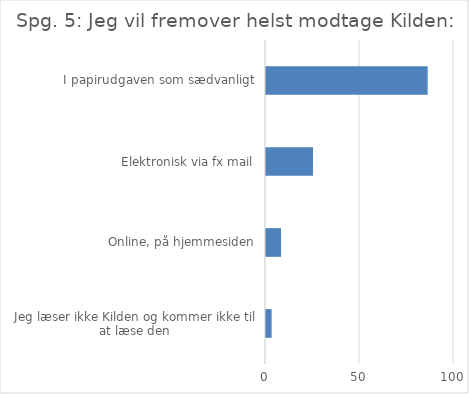
| Category | Svar |
|---|---|
| Jeg læser ikke Kilden og kommer ikke til at læse den | 3 |
| Online, på hjemmesiden | 8 |
| Elektronisk via fx mail | 25 |
| I papirudgaven som sædvanligt | 86 |